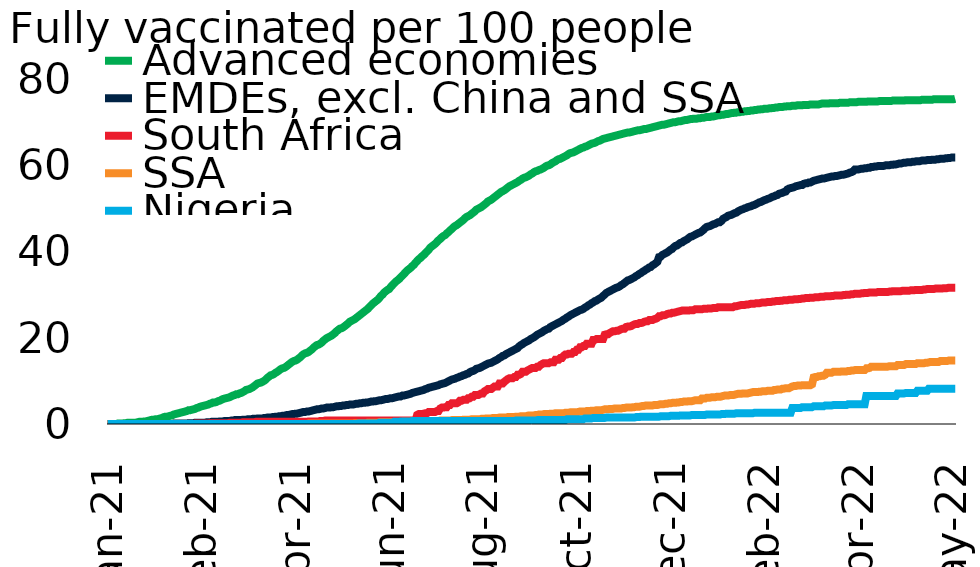
| Category | Advanced economies | EMDEs, excl. China and SSA | South Africa | SSA | Nigeria |
|---|---|---|---|---|---|
| 2021-01-01 | 0 | 0 | 0 | 0 | 0 |
| 2021-01-02 | 0 | 0 | 0 | 0 | 0 |
| 2021-01-03 | 0 | 0 | 0 | 0 | 0 |
| 2021-01-04 | 0 | 0 | 0 | 0 | 0 |
| 2021-01-05 | 0 | 0 | 0 | 0 | 0 |
| 2021-01-06 | 0 | 0 | 0 | 0 | 0 |
| 2021-01-07 | 0.1 | 0 | 0 | 0 | 0 |
| 2021-01-08 | 0.1 | 0 | 0 | 0 | 0 |
| 2021-01-09 | 0.1 | 0 | 0 | 0 | 0 |
| 2021-01-10 | 0.1 | 0 | 0 | 0 | 0 |
| 2021-01-11 | 0.2 | 0 | 0 | 0 | 0 |
| 2021-01-12 | 0.2 | 0 | 0 | 0 | 0 |
| 2021-01-13 | 0.3 | 0 | 0 | 0 | 0 |
| 2021-01-14 | 0.3 | 0 | 0 | 0 | 0 |
| 2021-01-15 | 0.3 | 0 | 0 | 0 | 0 |
| 2021-01-16 | 0.3 | 0 | 0 | 0 | 0 |
| 2021-01-17 | 0.3 | 0 | 0 | 0 | 0 |
| 2021-01-18 | 0.3 | 0 | 0 | 0 | 0 |
| 2021-01-19 | 0.4 | 0 | 0 | 0 | 0 |
| 2021-01-20 | 0.5 | 0 | 0 | 0 | 0 |
| 2021-01-21 | 0.5 | 0 | 0 | 0 | 0 |
| 2021-01-22 | 0.5 | 0 | 0 | 0 | 0 |
| 2021-01-23 | 0.6 | 0 | 0 | 0 | 0 |
| 2021-01-24 | 0.6 | 0 | 0 | 0 | 0 |
| 2021-01-25 | 0.7 | 0 | 0 | 0 | 0 |
| 2021-01-26 | 0.8 | 0 | 0 | 0 | 0 |
| 2021-01-27 | 0.9 | 0 | 0 | 0 | 0 |
| 2021-01-28 | 1 | 0 | 0 | 0 | 0 |
| 2021-01-29 | 1 | 0 | 0 | 0 | 0 |
| 2021-01-30 | 1.1 | 0 | 0 | 0 | 0 |
| 2021-01-31 | 1.1 | 0 | 0 | 0 | 0 |
| 2021-02-01 | 1.2 | 0 | 0 | 0 | 0 |
| 2021-02-02 | 1.3 | 0 | 0 | 0 | 0 |
| 2021-02-03 | 1.4 | 0 | 0 | 0 | 0 |
| 2021-02-04 | 1.6 | 0 | 0 | 0 | 0 |
| 2021-02-05 | 1.7 | 0 | 0 | 0 | 0 |
| 2021-02-06 | 1.7 | 0 | 0 | 0 | 0 |
| 2021-02-07 | 1.8 | 0 | 0 | 0 | 0 |
| 2021-02-08 | 1.9 | 0 | 0 | 0 | 0 |
| 2021-02-09 | 2 | 0 | 0 | 0 | 0 |
| 2021-02-10 | 2.2 | 0.1 | 0 | 0 | 0 |
| 2021-02-11 | 2.3 | 0.1 | 0 | 0 | 0 |
| 2021-02-12 | 2.4 | 0.1 | 0 | 0 | 0 |
| 2021-02-13 | 2.5 | 0.1 | 0 | 0 | 0 |
| 2021-02-14 | 2.6 | 0.1 | 0 | 0 | 0 |
| 2021-02-15 | 2.7 | 0.1 | 0 | 0 | 0 |
| 2021-02-16 | 2.8 | 0.1 | 0 | 0 | 0 |
| 2021-02-17 | 2.9 | 0.1 | 0 | 0 | 0 |
| 2021-02-18 | 3 | 0.1 | 0 | 0 | 0 |
| 2021-02-19 | 3.2 | 0.2 | 0 | 0 | 0 |
| 2021-02-20 | 3.2 | 0.2 | 0 | 0 | 0 |
| 2021-02-21 | 3.3 | 0.2 | 0 | 0 | 0 |
| 2021-02-22 | 3.4 | 0.2 | 0 | 0 | 0 |
| 2021-02-23 | 3.5 | 0.3 | 0.1 | 0 | 0 |
| 2021-02-24 | 3.7 | 0.3 | 0.1 | 0 | 0 |
| 2021-02-25 | 3.8 | 0.3 | 0.1 | 0 | 0 |
| 2021-02-26 | 4 | 0.3 | 0.1 | 0 | 0 |
| 2021-02-27 | 4.1 | 0.3 | 0.1 | 0 | 0 |
| 2021-02-28 | 4.2 | 0.3 | 0.1 | 0 | 0 |
| 2021-03-01 | 4.3 | 0.3 | 0.1 | 0 | 0 |
| 2021-03-02 | 4.4 | 0.4 | 0.1 | 0 | 0 |
| 2021-03-03 | 4.5 | 0.4 | 0.1 | 0 | 0 |
| 2021-03-04 | 4.7 | 0.4 | 0.2 | 0 | 0 |
| 2021-03-05 | 4.8 | 0.5 | 0.2 | 0 | 0 |
| 2021-03-06 | 5 | 0.5 | 0.2 | 0 | 0 |
| 2021-03-07 | 5 | 0.5 | 0.2 | 0 | 0 |
| 2021-03-08 | 5.1 | 0.5 | 0.2 | 0 | 0 |
| 2021-03-09 | 5.3 | 0.5 | 0.2 | 0 | 0 |
| 2021-03-10 | 5.4 | 0.6 | 0.2 | 0 | 0 |
| 2021-03-11 | 5.6 | 0.6 | 0.2 | 0 | 0 |
| 2021-03-12 | 5.8 | 0.6 | 0.2 | 0 | 0 |
| 2021-03-13 | 5.9 | 0.7 | 0.2 | 0 | 0 |
| 2021-03-14 | 6 | 0.7 | 0.2 | 0 | 0 |
| 2021-03-15 | 6.1 | 0.7 | 0.2 | 0 | 0 |
| 2021-03-16 | 6.2 | 0.7 | 0.3 | 0 | 0 |
| 2021-03-17 | 6.4 | 0.8 | 0.3 | 0 | 0 |
| 2021-03-18 | 6.6 | 0.8 | 0.3 | 0 | 0 |
| 2021-03-19 | 6.7 | 0.9 | 0.3 | 0 | 0 |
| 2021-03-20 | 6.9 | 0.9 | 0.3 | 0 | 0 |
| 2021-03-21 | 6.9 | 0.9 | 0.3 | 0 | 0 |
| 2021-03-22 | 7.1 | 0.9 | 0.3 | 0 | 0 |
| 2021-03-23 | 7.2 | 0.9 | 0.3 | 0 | 0 |
| 2021-03-24 | 7.4 | 1 | 0.4 | 0 | 0 |
| 2021-03-25 | 7.6 | 1 | 0.4 | 0 | 0 |
| 2021-03-26 | 7.9 | 1 | 0.4 | 0 | 0 |
| 2021-03-27 | 8 | 1.1 | 0.4 | 0 | 0 |
| 2021-03-28 | 8.1 | 1.1 | 0.4 | 0 | 0 |
| 2021-03-29 | 8.3 | 1.1 | 0.4 | 0 | 0 |
| 2021-03-30 | 8.5 | 1.2 | 0.4 | 0 | 0 |
| 2021-03-31 | 8.8 | 1.2 | 0.4 | 0 | 0 |
| 2021-04-01 | 9.1 | 1.2 | 0.5 | 0 | 0 |
| 2021-04-02 | 9.4 | 1.3 | 0.5 | 0 | 0 |
| 2021-04-03 | 9.5 | 1.3 | 0.5 | 0 | 0 |
| 2021-04-04 | 9.6 | 1.3 | 0.5 | 0 | 0 |
| 2021-04-05 | 9.8 | 1.3 | 0.5 | 0 | 0 |
| 2021-04-06 | 10 | 1.4 | 0.5 | 0 | 0 |
| 2021-04-07 | 10.3 | 1.4 | 0.5 | 0 | 0 |
| 2021-04-08 | 10.7 | 1.5 | 0.5 | 0 | 0 |
| 2021-04-09 | 11 | 1.5 | 0.5 | 0 | 0 |
| 2021-04-10 | 11.3 | 1.5 | 0.5 | 0 | 0 |
| 2021-04-11 | 11.4 | 1.6 | 0.5 | 0 | 0 |
| 2021-04-12 | 11.6 | 1.6 | 0.5 | 0 | 0 |
| 2021-04-13 | 11.9 | 1.7 | 0.5 | 0 | 0 |
| 2021-04-14 | 12.1 | 1.7 | 0.5 | 0 | 0 |
| 2021-04-15 | 12.4 | 1.8 | 0.5 | 0 | 0 |
| 2021-04-16 | 12.7 | 1.8 | 0.5 | 0 | 0 |
| 2021-04-17 | 12.9 | 1.9 | 0.5 | 0 | 0 |
| 2021-04-18 | 13 | 1.9 | 0.5 | 0 | 0 |
| 2021-04-19 | 13.2 | 2 | 0.5 | 0 | 0 |
| 2021-04-20 | 13.5 | 2.1 | 0.5 | 0 | 0 |
| 2021-04-21 | 13.8 | 2.1 | 0.5 | 0 | 0 |
| 2021-04-22 | 14.1 | 2.2 | 0.5 | 0 | 0 |
| 2021-04-23 | 14.4 | 2.3 | 0.5 | 0 | 0 |
| 2021-04-24 | 14.6 | 2.3 | 0.5 | 0 | 0 |
| 2021-04-25 | 14.7 | 2.4 | 0.5 | 0 | 0 |
| 2021-04-26 | 14.9 | 2.4 | 0.5 | 0 | 0 |
| 2021-04-27 | 15.2 | 2.5 | 0.5 | 0 | 0 |
| 2021-04-28 | 15.5 | 2.6 | 0.5 | 0 | 0 |
| 2021-04-29 | 15.9 | 2.7 | 0.5 | 0 | 0 |
| 2021-04-30 | 16.2 | 2.8 | 0.5 | 0 | 0 |
| 2021-05-01 | 16.4 | 2.8 | 0.5 | 0 | 0 |
| 2021-05-02 | 16.5 | 2.9 | 0.5 | 0 | 0 |
| 2021-05-03 | 16.7 | 2.9 | 0.6 | 0.1 | 0 |
| 2021-05-04 | 17 | 3 | 0.6 | 0.1 | 0 |
| 2021-05-05 | 17.3 | 3.1 | 0.6 | 0.1 | 0 |
| 2021-05-06 | 17.7 | 3.2 | 0.6 | 0.1 | 0 |
| 2021-05-07 | 18 | 3.3 | 0.6 | 0.1 | 0 |
| 2021-05-08 | 18.3 | 3.4 | 0.6 | 0.1 | 0 |
| 2021-05-09 | 18.4 | 3.4 | 0.6 | 0.1 | 0 |
| 2021-05-10 | 18.6 | 3.5 | 0.7 | 0.1 | 0 |
| 2021-05-11 | 18.9 | 3.6 | 0.7 | 0.1 | 0 |
| 2021-05-12 | 19.3 | 3.6 | 0.7 | 0.1 | 0 |
| 2021-05-13 | 19.6 | 3.7 | 0.8 | 0.1 | 0 |
| 2021-05-14 | 19.9 | 3.8 | 0.8 | 0.1 | 0 |
| 2021-05-15 | 20.1 | 3.8 | 0.8 | 0.1 | 0 |
| 2021-05-16 | 20.3 | 3.8 | 0.8 | 0.1 | 0 |
| 2021-05-17 | 20.5 | 3.9 | 0.8 | 0.1 | 0 |
| 2021-05-18 | 20.8 | 3.9 | 0.8 | 0.1 | 0 |
| 2021-05-19 | 21.1 | 4 | 0.8 | 0.1 | 0 |
| 2021-05-20 | 21.5 | 4.1 | 0.8 | 0.1 | 0 |
| 2021-05-21 | 21.8 | 4.1 | 0.8 | 0.1 | 0 |
| 2021-05-22 | 22.1 | 4.2 | 0.8 | 0.1 | 0 |
| 2021-05-23 | 22.2 | 4.2 | 0.8 | 0.1 | 0 |
| 2021-05-24 | 22.4 | 4.3 | 0.8 | 0.1 | 0 |
| 2021-05-25 | 22.7 | 4.3 | 0.8 | 0.1 | 0 |
| 2021-05-26 | 23 | 4.4 | 0.8 | 0.1 | 0 |
| 2021-05-27 | 23.3 | 4.4 | 0.8 | 0.1 | 0 |
| 2021-05-28 | 23.7 | 4.5 | 0.8 | 0.1 | 0 |
| 2021-05-29 | 23.9 | 4.5 | 0.8 | 0.1 | 0 |
| 2021-05-30 | 24.1 | 4.5 | 0.8 | 0.1 | 0 |
| 2021-05-31 | 24.3 | 4.6 | 0.8 | 0.2 | 0 |
| 2021-06-01 | 24.6 | 4.7 | 0.8 | 0.2 | 0 |
| 2021-06-02 | 24.9 | 4.7 | 0.8 | 0.2 | 0.1 |
| 2021-06-03 | 25.2 | 4.8 | 0.8 | 0.2 | 0.1 |
| 2021-06-04 | 25.5 | 4.8 | 0.8 | 0.2 | 0.1 |
| 2021-06-05 | 25.8 | 4.9 | 0.8 | 0.2 | 0.1 |
| 2021-06-06 | 26.1 | 4.9 | 0.8 | 0.2 | 0.1 |
| 2021-06-07 | 26.4 | 5 | 0.8 | 0.2 | 0.1 |
| 2021-06-08 | 26.7 | 5 | 0.8 | 0.3 | 0.1 |
| 2021-06-09 | 27.1 | 5.1 | 0.8 | 0.3 | 0.1 |
| 2021-06-10 | 27.5 | 5.2 | 0.8 | 0.3 | 0.1 |
| 2021-06-11 | 27.9 | 5.2 | 0.8 | 0.3 | 0.1 |
| 2021-06-12 | 28.2 | 5.3 | 0.8 | 0.3 | 0.1 |
| 2021-06-13 | 28.5 | 5.3 | 0.8 | 0.3 | 0.1 |
| 2021-06-14 | 28.8 | 5.4 | 0.8 | 0.3 | 0.1 |
| 2021-06-15 | 29.2 | 5.5 | 0.8 | 0.4 | 0.3 |
| 2021-06-16 | 29.7 | 5.5 | 0.8 | 0.4 | 0.3 |
| 2021-06-17 | 30 | 5.6 | 0.8 | 0.4 | 0.3 |
| 2021-06-18 | 30.5 | 5.7 | 0.8 | 0.4 | 0.3 |
| 2021-06-19 | 30.8 | 5.8 | 0.8 | 0.4 | 0.3 |
| 2021-06-20 | 31.1 | 5.8 | 0.8 | 0.4 | 0.3 |
| 2021-06-21 | 31.3 | 5.9 | 0.8 | 0.4 | 0.3 |
| 2021-06-22 | 31.8 | 6 | 0.8 | 0.4 | 0.3 |
| 2021-06-23 | 32.2 | 6 | 0.8 | 0.4 | 0.3 |
| 2021-06-24 | 32.6 | 6.1 | 0.8 | 0.4 | 0.5 |
| 2021-06-25 | 33 | 6.2 | 0.8 | 0.4 | 0.5 |
| 2021-06-26 | 33.3 | 6.3 | 0.8 | 0.4 | 0.5 |
| 2021-06-27 | 33.6 | 6.4 | 0.8 | 0.4 | 0.5 |
| 2021-06-28 | 34 | 6.4 | 0.8 | 0.4 | 0.6 |
| 2021-06-29 | 34.4 | 6.6 | 0.8 | 0.5 | 0.6 |
| 2021-06-30 | 34.8 | 6.6 | 0.8 | 0.5 | 0.6 |
| 2021-07-01 | 35.2 | 6.7 | 0.8 | 0.5 | 0.6 |
| 2021-07-02 | 35.6 | 6.8 | 0.8 | 0.5 | 0.6 |
| 2021-07-03 | 35.9 | 6.9 | 0.8 | 0.5 | 0.6 |
| 2021-07-04 | 36.2 | 7 | 0.8 | 0.5 | 0.6 |
| 2021-07-05 | 36.6 | 7.2 | 0.8 | 0.5 | 0.7 |
| 2021-07-06 | 36.9 | 7.3 | 0.8 | 0.5 | 0.7 |
| 2021-07-07 | 37.4 | 7.4 | 0.8 | 0.5 | 0.7 |
| 2021-07-08 | 37.8 | 7.5 | 2.1 | 0.6 | 0.7 |
| 2021-07-09 | 38.2 | 7.6 | 2.3 | 0.6 | 0.7 |
| 2021-07-10 | 38.5 | 7.7 | 2.3 | 0.6 | 0.7 |
| 2021-07-11 | 38.9 | 7.8 | 2.3 | 0.6 | 0.7 |
| 2021-07-12 | 39.2 | 7.9 | 2.4 | 0.6 | 0.7 |
| 2021-07-13 | 39.6 | 8.1 | 2.5 | 0.6 | 0.7 |
| 2021-07-14 | 40 | 8.2 | 2.5 | 0.6 | 0.7 |
| 2021-07-15 | 40.4 | 8.4 | 2.8 | 0.7 | 0.7 |
| 2021-07-16 | 40.9 | 8.5 | 2.8 | 0.7 | 0.7 |
| 2021-07-17 | 41.2 | 8.6 | 2.8 | 0.7 | 0.7 |
| 2021-07-18 | 41.5 | 8.7 | 2.8 | 0.7 | 0.7 |
| 2021-07-19 | 41.8 | 8.8 | 2.8 | 0.7 | 0.7 |
| 2021-07-20 | 42.2 | 8.9 | 3 | 0.7 | 0.7 |
| 2021-07-21 | 42.6 | 9 | 3 | 0.7 | 0.7 |
| 2021-07-22 | 42.9 | 9.2 | 3.6 | 0.8 | 0.7 |
| 2021-07-23 | 43.3 | 9.3 | 3.8 | 0.8 | 0.7 |
| 2021-07-24 | 43.6 | 9.4 | 3.8 | 0.8 | 0.7 |
| 2021-07-25 | 43.8 | 9.5 | 3.9 | 0.8 | 0.7 |
| 2021-07-26 | 44.2 | 9.7 | 3.9 | 0.8 | 0.7 |
| 2021-07-27 | 44.5 | 9.9 | 4.4 | 0.8 | 0.7 |
| 2021-07-28 | 44.9 | 10.1 | 4.4 | 0.8 | 0.7 |
| 2021-07-29 | 45.2 | 10.3 | 4.8 | 0.9 | 0.7 |
| 2021-07-30 | 45.6 | 10.4 | 4.8 | 0.9 | 0.7 |
| 2021-07-31 | 45.9 | 10.5 | 4.8 | 0.9 | 0.7 |
| 2021-08-01 | 46.1 | 10.7 | 4.8 | 0.9 | 0.7 |
| 2021-08-02 | 46.4 | 10.8 | 5 | 0.9 | 0.7 |
| 2021-08-03 | 46.7 | 11 | 5.4 | 0.9 | 0.7 |
| 2021-08-04 | 47 | 11.1 | 5.4 | 0.9 | 0.7 |
| 2021-08-05 | 47.3 | 11.3 | 5.6 | 1 | 0.7 |
| 2021-08-06 | 47.7 | 11.4 | 5.6 | 1 | 0.7 |
| 2021-08-07 | 48 | 11.6 | 5.6 | 1 | 0.7 |
| 2021-08-08 | 48.2 | 11.7 | 6 | 1 | 0.7 |
| 2021-08-09 | 48.4 | 12 | 6 | 1 | 0.7 |
| 2021-08-10 | 48.7 | 12.2 | 6.3 | 1.1 | 0.7 |
| 2021-08-11 | 49 | 12.3 | 6.3 | 1.1 | 0.7 |
| 2021-08-12 | 49.3 | 12.5 | 6.7 | 1.1 | 0.7 |
| 2021-08-13 | 49.7 | 12.8 | 6.7 | 1.1 | 0.7 |
| 2021-08-14 | 49.9 | 12.9 | 6.7 | 1.1 | 0.7 |
| 2021-08-15 | 50.1 | 13 | 6.9 | 1.1 | 0.7 |
| 2021-08-16 | 50.3 | 13.2 | 7.1 | 1.2 | 0.7 |
| 2021-08-17 | 50.6 | 13.4 | 7.1 | 1.2 | 0.7 |
| 2021-08-18 | 50.9 | 13.6 | 7.6 | 1.2 | 0.7 |
| 2021-08-19 | 51.2 | 13.8 | 7.8 | 1.3 | 0.7 |
| 2021-08-20 | 51.6 | 14 | 8.1 | 1.3 | 0.7 |
| 2021-08-21 | 51.8 | 14.1 | 8.1 | 1.3 | 0.7 |
| 2021-08-22 | 52 | 14.2 | 8.1 | 1.3 | 0.7 |
| 2021-08-23 | 52.3 | 14.4 | 8.4 | 1.4 | 0.7 |
| 2021-08-24 | 52.6 | 14.6 | 8.7 | 1.4 | 0.7 |
| 2021-08-25 | 52.9 | 14.8 | 8.7 | 1.4 | 0.7 |
| 2021-08-26 | 53.2 | 15 | 8.7 | 1.4 | 0.7 |
| 2021-08-27 | 53.5 | 15.3 | 9.4 | 1.5 | 0.7 |
| 2021-08-28 | 53.8 | 15.5 | 9.4 | 1.5 | 0.7 |
| 2021-08-29 | 54 | 15.8 | 9.4 | 1.5 | 0.7 |
| 2021-08-30 | 54.2 | 15.9 | 9.8 | 1.5 | 0.7 |
| 2021-08-31 | 54.5 | 16.2 | 10.1 | 1.5 | 0.7 |
| 2021-09-01 | 54.8 | 16.4 | 10.4 | 1.6 | 0.7 |
| 2021-09-02 | 55.1 | 16.6 | 10.6 | 1.6 | 0.7 |
| 2021-09-03 | 55.3 | 16.8 | 10.6 | 1.6 | 0.7 |
| 2021-09-04 | 55.5 | 17 | 10.6 | 1.6 | 0.7 |
| 2021-09-05 | 55.7 | 17.2 | 10.9 | 1.6 | 0.7 |
| 2021-09-06 | 55.9 | 17.4 | 10.9 | 1.7 | 0.8 |
| 2021-09-07 | 56.1 | 17.6 | 11.4 | 1.7 | 0.8 |
| 2021-09-08 | 56.4 | 18 | 11.4 | 1.7 | 0.8 |
| 2021-09-09 | 56.6 | 18.3 | 11.6 | 1.8 | 0.8 |
| 2021-09-10 | 56.9 | 18.5 | 12.1 | 1.8 | 0.8 |
| 2021-09-11 | 57.1 | 18.8 | 12.1 | 1.8 | 0.8 |
| 2021-09-12 | 57.2 | 19 | 12.1 | 1.8 | 0.8 |
| 2021-09-13 | 57.4 | 19.2 | 12.4 | 1.9 | 0.8 |
| 2021-09-14 | 57.6 | 19.4 | 12.6 | 2 | 0.8 |
| 2021-09-15 | 57.9 | 19.7 | 12.8 | 2 | 0.8 |
| 2021-09-16 | 58.1 | 19.9 | 13 | 2 | 0.8 |
| 2021-09-17 | 58.4 | 20.1 | 13 | 2 | 0.8 |
| 2021-09-18 | 58.6 | 20.4 | 13 | 2.1 | 0.8 |
| 2021-09-19 | 58.7 | 20.7 | 13.3 | 2.1 | 0.9 |
| 2021-09-20 | 58.9 | 20.9 | 13.3 | 2.2 | 0.9 |
| 2021-09-21 | 59 | 21.1 | 13.7 | 2.2 | 0.9 |
| 2021-09-22 | 59.2 | 21.3 | 13.9 | 2.2 | 0.9 |
| 2021-09-23 | 59.4 | 21.6 | 14.1 | 2.3 | 0.9 |
| 2021-09-24 | 59.7 | 21.8 | 14.1 | 2.3 | 0.9 |
| 2021-09-25 | 59.9 | 22 | 14.1 | 2.3 | 0.9 |
| 2021-09-26 | 60 | 22.1 | 14.1 | 2.3 | 0.9 |
| 2021-09-27 | 60.2 | 22.5 | 14.3 | 2.4 | 0.9 |
| 2021-09-28 | 60.5 | 22.7 | 14.3 | 2.4 | 0.9 |
| 2021-09-29 | 60.7 | 22.9 | 14.3 | 2.4 | 0.9 |
| 2021-09-30 | 60.9 | 23.1 | 14.9 | 2.5 | 0.9 |
| 2021-10-01 | 61.2 | 23.3 | 14.9 | 2.5 | 0.9 |
| 2021-10-02 | 61.4 | 23.5 | 14.9 | 2.5 | 0.9 |
| 2021-10-03 | 61.5 | 23.7 | 15.3 | 2.5 | 0.9 |
| 2021-10-04 | 61.7 | 23.9 | 15.3 | 2.5 | 0.9 |
| 2021-10-05 | 61.9 | 24.2 | 15.8 | 2.5 | 0.9 |
| 2021-10-06 | 62.1 | 24.4 | 16.1 | 2.6 | 0.9 |
| 2021-10-07 | 62.3 | 24.7 | 16.1 | 2.6 | 1.1 |
| 2021-10-08 | 62.6 | 24.9 | 16.3 | 2.6 | 1.1 |
| 2021-10-09 | 62.8 | 25.2 | 16.3 | 2.7 | 1.1 |
| 2021-10-10 | 62.9 | 25.4 | 16.3 | 2.7 | 1.1 |
| 2021-10-11 | 63 | 25.6 | 16.7 | 2.7 | 1.1 |
| 2021-10-12 | 63.2 | 25.8 | 16.7 | 2.7 | 1.1 |
| 2021-10-13 | 63.4 | 26 | 17.2 | 2.7 | 1.1 |
| 2021-10-14 | 63.6 | 26.2 | 17.2 | 2.8 | 1.1 |
| 2021-10-15 | 63.8 | 26.4 | 17.8 | 2.9 | 1.1 |
| 2021-10-16 | 64 | 26.5 | 17.8 | 2.9 | 1.1 |
| 2021-10-17 | 64.1 | 26.7 | 18.1 | 2.9 | 1.1 |
| 2021-10-18 | 64.3 | 27 | 18.1 | 2.9 | 1.3 |
| 2021-10-19 | 64.4 | 27.2 | 18.6 | 3 | 1.3 |
| 2021-10-20 | 64.6 | 27.5 | 18.6 | 3 | 1.3 |
| 2021-10-21 | 64.8 | 27.7 | 18.6 | 3 | 1.3 |
| 2021-10-22 | 65 | 28 | 18.6 | 3.1 | 1.3 |
| 2021-10-23 | 65.1 | 28.2 | 19.5 | 3.1 | 1.4 |
| 2021-10-24 | 65.2 | 28.5 | 19.5 | 3.1 | 1.4 |
| 2021-10-25 | 65.4 | 28.6 | 19.7 | 3.2 | 1.4 |
| 2021-10-26 | 65.6 | 28.9 | 19.7 | 3.2 | 1.4 |
| 2021-10-27 | 65.7 | 29.1 | 19.7 | 3.2 | 1.4 |
| 2021-10-28 | 65.9 | 29.3 | 19.7 | 3.2 | 1.4 |
| 2021-10-29 | 66.1 | 29.7 | 19.7 | 3.3 | 1.4 |
| 2021-10-30 | 66.2 | 30 | 20.7 | 3.4 | 1.4 |
| 2021-10-31 | 66.3 | 30.4 | 20.8 | 3.4 | 1.5 |
| 2021-11-01 | 66.4 | 30.6 | 20.8 | 3.4 | 1.5 |
| 2021-11-02 | 66.5 | 30.8 | 21.1 | 3.5 | 1.5 |
| 2021-11-03 | 66.6 | 31 | 21.3 | 3.5 | 1.5 |
| 2021-11-04 | 66.7 | 31.2 | 21.5 | 3.5 | 1.5 |
| 2021-11-05 | 66.8 | 31.4 | 21.5 | 3.6 | 1.5 |
| 2021-11-06 | 66.9 | 31.6 | 21.6 | 3.6 | 1.5 |
| 2021-11-07 | 67 | 31.7 | 21.6 | 3.6 | 1.5 |
| 2021-11-08 | 67.1 | 31.9 | 21.8 | 3.6 | 1.5 |
| 2021-11-09 | 67.2 | 32.2 | 22 | 3.6 | 1.5 |
| 2021-11-10 | 67.3 | 32.4 | 22.1 | 3.7 | 1.5 |
| 2021-11-11 | 67.4 | 32.7 | 22.1 | 3.7 | 1.5 |
| 2021-11-12 | 67.5 | 33 | 22.5 | 3.8 | 1.5 |
| 2021-11-13 | 67.6 | 33.3 | 22.6 | 3.8 | 1.5 |
| 2021-11-14 | 67.6 | 33.4 | 22.6 | 3.8 | 1.5 |
| 2021-11-15 | 67.7 | 33.6 | 22.7 | 3.8 | 1.5 |
| 2021-11-16 | 67.8 | 33.8 | 22.9 | 3.9 | 1.5 |
| 2021-11-17 | 67.9 | 34 | 23.1 | 3.9 | 1.5 |
| 2021-11-18 | 68 | 34.3 | 23.2 | 4 | 1.6 |
| 2021-11-19 | 68.1 | 34.5 | 23.2 | 4 | 1.6 |
| 2021-11-20 | 68.1 | 34.8 | 23.4 | 4 | 1.6 |
| 2021-11-21 | 68.2 | 35 | 23.4 | 4.1 | 1.7 |
| 2021-11-22 | 68.3 | 35.3 | 23.5 | 4.2 | 1.7 |
| 2021-11-23 | 68.4 | 35.5 | 23.7 | 4.2 | 1.7 |
| 2021-11-24 | 68.4 | 35.8 | 23.8 | 4.3 | 1.7 |
| 2021-11-25 | 68.5 | 36 | 23.8 | 4.3 | 1.7 |
| 2021-11-26 | 68.6 | 36.3 | 24.1 | 4.3 | 1.7 |
| 2021-11-27 | 68.7 | 36.4 | 24.1 | 4.3 | 1.7 |
| 2021-11-28 | 68.8 | 36.8 | 24.1 | 4.3 | 1.7 |
| 2021-11-29 | 68.9 | 37 | 24.3 | 4.4 | 1.7 |
| 2021-11-30 | 69 | 37.3 | 24.4 | 4.4 | 1.7 |
| 2021-12-01 | 69.1 | 37.6 | 24.6 | 4.4 | 1.7 |
| 2021-12-02 | 69.2 | 38.7 | 25 | 4.5 | 1.7 |
| 2021-12-03 | 69.3 | 38.8 | 25 | 4.6 | 1.8 |
| 2021-12-04 | 69.4 | 39.2 | 25.2 | 4.6 | 1.8 |
| 2021-12-05 | 69.4 | 39.4 | 25.2 | 4.6 | 1.8 |
| 2021-12-06 | 69.5 | 39.6 | 25.3 | 4.7 | 1.8 |
| 2021-12-07 | 69.6 | 39.8 | 25.5 | 4.7 | 1.8 |
| 2021-12-08 | 69.7 | 40.1 | 25.6 | 4.8 | 1.8 |
| 2021-12-09 | 69.8 | 40.4 | 25.6 | 4.8 | 1.9 |
| 2021-12-10 | 69.9 | 40.6 | 25.8 | 4.9 | 1.9 |
| 2021-12-11 | 70 | 41 | 25.8 | 4.9 | 1.9 |
| 2021-12-12 | 70 | 41.3 | 25.9 | 4.9 | 1.9 |
| 2021-12-13 | 70.1 | 41.4 | 26 | 5 | 1.9 |
| 2021-12-14 | 70.2 | 41.7 | 26.1 | 5 | 1.9 |
| 2021-12-15 | 70.2 | 42 | 26.2 | 5.1 | 2 |
| 2021-12-16 | 70.3 | 42.1 | 26.3 | 5.1 | 2 |
| 2021-12-17 | 70.4 | 42.4 | 26.3 | 5.2 | 2 |
| 2021-12-18 | 70.5 | 42.6 | 26.3 | 5.2 | 2 |
| 2021-12-19 | 70.5 | 42.8 | 26.3 | 5.2 | 2 |
| 2021-12-20 | 70.6 | 43.1 | 26.3 | 5.3 | 2 |
| 2021-12-21 | 70.7 | 43.4 | 26.4 | 5.3 | 2 |
| 2021-12-22 | 70.7 | 43.5 | 26.4 | 5.3 | 2.1 |
| 2021-12-23 | 70.8 | 43.7 | 26.4 | 5.4 | 2.1 |
| 2021-12-24 | 70.8 | 43.9 | 26.6 | 5.5 | 2.1 |
| 2021-12-25 | 70.8 | 44.1 | 26.6 | 5.5 | 2.1 |
| 2021-12-26 | 70.9 | 44.3 | 26.6 | 5.5 | 2.1 |
| 2021-12-27 | 70.9 | 44.4 | 26.6 | 5.5 | 2.1 |
| 2021-12-28 | 71 | 44.7 | 26.6 | 5.9 | 2.1 |
| 2021-12-29 | 71 | 45 | 26.7 | 5.9 | 2.1 |
| 2021-12-30 | 71.1 | 45.4 | 26.7 | 5.9 | 2.1 |
| 2021-12-31 | 71.2 | 45.7 | 26.7 | 6.1 | 2.2 |
| 2022-01-01 | 71.2 | 45.8 | 26.8 | 6.1 | 2.2 |
| 2022-01-02 | 71.2 | 45.9 | 26.8 | 6.1 | 2.2 |
| 2022-01-03 | 71.3 | 46.1 | 26.8 | 6.2 | 2.2 |
| 2022-01-04 | 71.3 | 46.3 | 26.9 | 6.2 | 2.2 |
| 2022-01-05 | 71.4 | 46.4 | 26.9 | 6.2 | 2.2 |
| 2022-01-06 | 71.5 | 46.6 | 26.9 | 6.3 | 2.2 |
| 2022-01-07 | 71.6 | 46.8 | 27.1 | 6.3 | 2.2 |
| 2022-01-08 | 71.6 | 46.8 | 27.1 | 6.3 | 2.2 |
| 2022-01-09 | 71.7 | 47.1 | 27.1 | 6.4 | 2.3 |
| 2022-01-10 | 71.7 | 47.6 | 27.1 | 6.5 | 2.3 |
| 2022-01-11 | 71.8 | 47.8 | 27.1 | 6.6 | 2.3 |
| 2022-01-12 | 71.9 | 48 | 27.1 | 6.6 | 2.4 |
| 2022-01-13 | 71.9 | 48.3 | 27.1 | 6.6 | 2.4 |
| 2022-01-14 | 72 | 48.4 | 27.1 | 6.7 | 2.4 |
| 2022-01-15 | 72.1 | 48.5 | 27.1 | 6.7 | 2.4 |
| 2022-01-16 | 72.1 | 48.7 | 27.1 | 6.7 | 2.4 |
| 2022-01-17 | 72.2 | 48.9 | 27.3 | 6.8 | 2.4 |
| 2022-01-18 | 72.2 | 49 | 27.3 | 6.9 | 2.5 |
| 2022-01-19 | 72.3 | 49.3 | 27.4 | 7 | 2.5 |
| 2022-01-20 | 72.3 | 49.5 | 27.5 | 7 | 2.5 |
| 2022-01-21 | 72.4 | 49.7 | 27.6 | 7 | 2.5 |
| 2022-01-22 | 72.4 | 49.8 | 27.6 | 7.1 | 2.5 |
| 2022-01-23 | 72.5 | 50 | 27.6 | 7.1 | 2.5 |
| 2022-01-24 | 72.5 | 50.1 | 27.7 | 7.1 | 2.5 |
| 2022-01-25 | 72.6 | 50.3 | 27.7 | 7.1 | 2.5 |
| 2022-01-26 | 72.6 | 50.4 | 27.8 | 7.2 | 2.5 |
| 2022-01-27 | 72.7 | 50.5 | 27.9 | 7.3 | 2.5 |
| 2022-01-28 | 72.7 | 50.7 | 27.9 | 7.4 | 2.5 |
| 2022-01-29 | 72.8 | 50.8 | 27.9 | 7.4 | 2.6 |
| 2022-01-30 | 72.8 | 51 | 28 | 7.4 | 2.6 |
| 2022-01-31 | 72.9 | 51.2 | 28 | 7.4 | 2.6 |
| 2022-02-01 | 72.9 | 51.4 | 28 | 7.5 | 2.6 |
| 2022-02-02 | 73 | 51.5 | 28.1 | 7.5 | 2.6 |
| 2022-02-03 | 73 | 51.7 | 28.2 | 7.6 | 2.6 |
| 2022-02-04 | 73.1 | 51.9 | 28.2 | 7.6 | 2.6 |
| 2022-02-05 | 73.1 | 52 | 28.2 | 7.6 | 2.6 |
| 2022-02-06 | 73.1 | 52.2 | 28.3 | 7.7 | 2.6 |
| 2022-02-07 | 73.2 | 52.3 | 28.3 | 7.7 | 2.6 |
| 2022-02-08 | 73.2 | 52.5 | 28.3 | 7.7 | 2.6 |
| 2022-02-09 | 73.3 | 52.7 | 28.4 | 7.7 | 2.6 |
| 2022-02-10 | 73.3 | 52.8 | 28.4 | 7.9 | 2.6 |
| 2022-02-11 | 73.4 | 53 | 28.5 | 7.9 | 2.6 |
| 2022-02-12 | 73.4 | 53.1 | 28.5 | 8 | 2.6 |
| 2022-02-13 | 73.5 | 53.4 | 28.5 | 8 | 2.6 |
| 2022-02-14 | 73.5 | 53.5 | 28.6 | 8 | 2.6 |
| 2022-02-15 | 73.5 | 53.6 | 28.6 | 8.2 | 2.6 |
| 2022-02-16 | 73.6 | 53.8 | 28.7 | 8.2 | 2.6 |
| 2022-02-17 | 73.6 | 53.9 | 28.7 | 8.3 | 2.6 |
| 2022-02-18 | 73.7 | 54.4 | 28.7 | 8.3 | 2.6 |
| 2022-02-19 | 73.7 | 54.6 | 28.8 | 8.3 | 2.6 |
| 2022-02-20 | 73.7 | 54.7 | 28.8 | 8.5 | 2.6 |
| 2022-02-21 | 73.8 | 54.8 | 28.8 | 8.7 | 3.7 |
| 2022-02-22 | 73.8 | 54.9 | 28.9 | 8.8 | 3.7 |
| 2022-02-23 | 73.8 | 55.1 | 28.9 | 8.8 | 3.7 |
| 2022-02-24 | 73.9 | 55.2 | 28.9 | 8.9 | 3.7 |
| 2022-02-25 | 73.9 | 55.3 | 29 | 8.9 | 3.7 |
| 2022-02-26 | 73.9 | 55.4 | 29 | 8.9 | 3.7 |
| 2022-02-27 | 73.9 | 55.4 | 29.1 | 9 | 3.9 |
| 2022-02-28 | 74 | 55.7 | 29.1 | 9 | 3.9 |
| 2022-03-01 | 74 | 55.8 | 29.2 | 9 | 3.9 |
| 2022-03-02 | 74 | 55.8 | 29.2 | 9 | 3.9 |
| 2022-03-03 | 74 | 56 | 29.2 | 9 | 3.9 |
| 2022-03-04 | 74.1 | 56 | 29.3 | 9 | 3.9 |
| 2022-03-05 | 74.1 | 56.2 | 29.3 | 9.2 | 3.9 |
| 2022-03-06 | 74.1 | 56.4 | 29.3 | 10.8 | 4.1 |
| 2022-03-07 | 74.1 | 56.5 | 29.4 | 10.9 | 4.1 |
| 2022-03-08 | 74.1 | 56.6 | 29.4 | 10.9 | 4.1 |
| 2022-03-09 | 74.1 | 56.7 | 29.4 | 11.1 | 4.1 |
| 2022-03-10 | 74.2 | 56.8 | 29.5 | 11.1 | 4.1 |
| 2022-03-11 | 74.3 | 56.9 | 29.5 | 11.2 | 4.1 |
| 2022-03-12 | 74.3 | 56.9 | 29.5 | 11.2 | 4.1 |
| 2022-03-13 | 74.3 | 57 | 29.6 | 11.4 | 4.3 |
| 2022-03-14 | 74.3 | 57.1 | 29.6 | 11.9 | 4.3 |
| 2022-03-15 | 74.3 | 57.2 | 29.6 | 11.9 | 4.3 |
| 2022-03-16 | 74.4 | 57.3 | 29.6 | 11.9 | 4.3 |
| 2022-03-17 | 74.4 | 57.4 | 29.7 | 11.9 | 4.3 |
| 2022-03-18 | 74.4 | 57.4 | 29.7 | 12.1 | 4.4 |
| 2022-03-19 | 74.4 | 57.5 | 29.8 | 12.1 | 4.4 |
| 2022-03-20 | 74.4 | 57.5 | 29.8 | 12.1 | 4.4 |
| 2022-03-21 | 74.4 | 57.6 | 29.8 | 12.1 | 4.4 |
| 2022-03-22 | 74.5 | 57.7 | 29.8 | 12.1 | 4.4 |
| 2022-03-23 | 74.5 | 57.8 | 29.8 | 12.2 | 4.4 |
| 2022-03-24 | 74.5 | 57.8 | 29.9 | 12.2 | 4.4 |
| 2022-03-25 | 74.5 | 57.9 | 29.9 | 12.2 | 4.4 |
| 2022-03-26 | 74.5 | 58 | 30 | 12.2 | 4.4 |
| 2022-03-27 | 74.5 | 58.1 | 30 | 12.3 | 4.6 |
| 2022-03-28 | 74.6 | 58.3 | 30 | 12.3 | 4.6 |
| 2022-03-29 | 74.6 | 58.4 | 30.1 | 12.4 | 4.6 |
| 2022-03-30 | 74.6 | 58.6 | 30.1 | 12.4 | 4.6 |
| 2022-03-31 | 74.6 | 59 | 30.2 | 12.5 | 4.6 |
| 2022-04-01 | 74.6 | 59 | 30.2 | 12.5 | 4.6 |
| 2022-04-02 | 74.7 | 59 | 30.2 | 12.5 | 4.6 |
| 2022-04-03 | 74.7 | 59.1 | 30.2 | 12.5 | 4.6 |
| 2022-04-04 | 74.7 | 59.2 | 30.3 | 12.5 | 4.6 |
| 2022-04-05 | 74.7 | 59.2 | 30.3 | 12.5 | 4.6 |
| 2022-04-06 | 74.7 | 59.3 | 30.4 | 12.5 | 4.6 |
| 2022-04-07 | 74.7 | 59.3 | 30.4 | 12.9 | 6.5 |
| 2022-04-08 | 74.8 | 59.4 | 30.4 | 12.9 | 6.5 |
| 2022-04-09 | 74.8 | 59.4 | 30.5 | 13 | 6.5 |
| 2022-04-10 | 74.8 | 59.6 | 30.5 | 13.3 | 6.5 |
| 2022-04-11 | 74.8 | 59.6 | 30.5 | 13.3 | 6.5 |
| 2022-04-12 | 74.8 | 59.7 | 30.5 | 13.3 | 6.5 |
| 2022-04-13 | 74.8 | 59.7 | 30.5 | 13.3 | 6.5 |
| 2022-04-14 | 74.8 | 59.8 | 30.6 | 13.3 | 6.5 |
| 2022-04-15 | 74.9 | 59.8 | 30.6 | 13.3 | 6.5 |
| 2022-04-16 | 74.9 | 59.8 | 30.6 | 13.3 | 6.5 |
| 2022-04-17 | 74.9 | 59.8 | 30.6 | 13.3 | 6.5 |
| 2022-04-18 | 74.9 | 59.9 | 30.6 | 13.3 | 6.5 |
| 2022-04-19 | 74.9 | 60 | 30.6 | 13.3 | 6.5 |
| 2022-04-20 | 74.9 | 60 | 30.6 | 13.3 | 6.5 |
| 2022-04-21 | 74.9 | 60 | 30.7 | 13.4 | 6.5 |
| 2022-04-22 | 74.9 | 60.1 | 30.7 | 13.4 | 6.5 |
| 2022-04-23 | 75 | 60.1 | 30.8 | 13.4 | 6.5 |
| 2022-04-24 | 75 | 60.2 | 30.8 | 13.4 | 6.5 |
| 2022-04-25 | 75 | 60.2 | 30.8 | 13.4 | 6.5 |
| 2022-04-26 | 75 | 60.3 | 30.8 | 13.7 | 7.1 |
| 2022-04-27 | 75 | 60.4 | 30.8 | 13.7 | 7.1 |
| 2022-04-28 | 75 | 60.4 | 30.8 | 13.7 | 7.1 |
| 2022-04-29 | 75 | 60.5 | 30.9 | 13.7 | 7.1 |
| 2022-04-30 | 75 | 60.6 | 30.9 | 13.7 | 7.1 |
| 2022-05-01 | 75.1 | 60.6 | 30.9 | 13.9 | 7.2 |
| 2022-05-02 | 75.1 | 60.7 | 30.9 | 13.9 | 7.2 |
| 2022-05-03 | 75.1 | 60.7 | 30.9 | 13.9 | 7.2 |
| 2022-05-04 | 75.1 | 60.7 | 31 | 13.9 | 7.2 |
| 2022-05-05 | 75.1 | 60.8 | 31 | 13.9 | 7.2 |
| 2022-05-06 | 75.1 | 60.8 | 31 | 13.9 | 7.2 |
| 2022-05-07 | 75.1 | 60.9 | 31.1 | 13.9 | 7.2 |
| 2022-05-08 | 75.1 | 60.9 | 31.1 | 14.1 | 7.7 |
| 2022-05-09 | 75.1 | 60.9 | 31.1 | 14.1 | 7.7 |
| 2022-05-10 | 75.1 | 61 | 31.1 | 14.1 | 7.7 |
| 2022-05-11 | 75.2 | 61.1 | 31.1 | 14.1 | 7.7 |
| 2022-05-12 | 75.2 | 61.1 | 31.2 | 14.1 | 7.7 |
| 2022-05-13 | 75.2 | 61.1 | 31.2 | 14.2 | 7.7 |
| 2022-05-14 | 75.2 | 61.2 | 31.3 | 14.2 | 7.7 |
| 2022-05-15 | 75.2 | 61.2 | 31.3 | 14.3 | 8.2 |
| 2022-05-16 | 75.2 | 61.2 | 31.3 | 14.4 | 8.2 |
| 2022-05-17 | 75.2 | 61.3 | 31.3 | 14.4 | 8.2 |
| 2022-05-18 | 75.3 | 61.3 | 31.3 | 14.4 | 8.2 |
| 2022-05-19 | 75.3 | 61.3 | 31.4 | 14.4 | 8.2 |
| 2022-05-20 | 75.3 | 61.4 | 31.4 | 14.4 | 8.2 |
| 2022-05-21 | 75.3 | 61.4 | 31.4 | 14.4 | 8.2 |
| 2022-05-22 | 75.3 | 61.5 | 31.4 | 14.6 | 8.2 |
| 2022-05-23 | 75.3 | 61.5 | 31.4 | 14.6 | 8.2 |
| 2022-05-24 | 75.3 | 61.5 | 31.5 | 14.6 | 8.2 |
| 2022-05-25 | 75.3 | 61.6 | 31.5 | 14.6 | 8.2 |
| 2022-05-26 | 75.3 | 61.6 | 31.5 | 14.6 | 8.2 |
| 2022-05-27 | 75.3 | 61.7 | 31.6 | 14.7 | 8.2 |
| 2022-05-28 | 75.3 | 61.7 | 31.6 | 14.7 | 8.2 |
| 2022-05-29 | 75.3 | 61.8 | 31.6 | 14.7 | 8.2 |
| 2022-05-30 | 75.3 | 61.8 | 31.6 | 14.7 | 8.2 |
| 2022-05-31 | 75.4 | 61.8 | 31.6 | 14.7 | 8.2 |